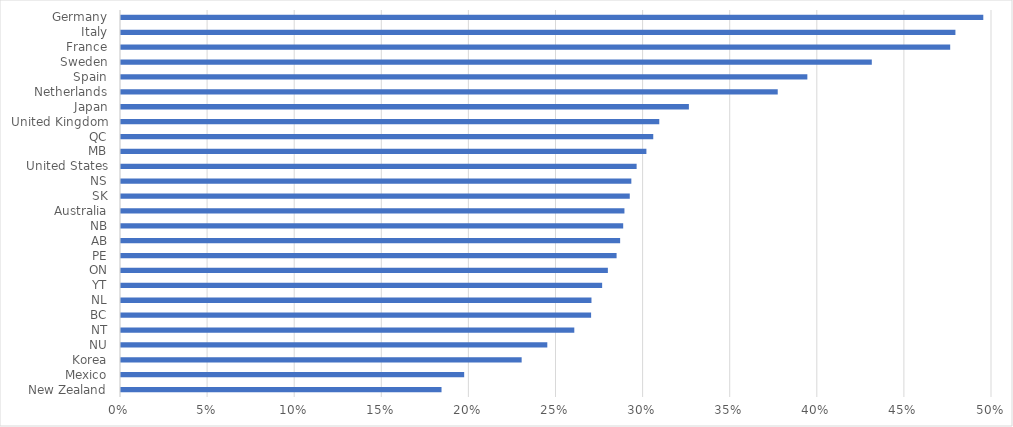
| Category | Single 100 |
|---|---|
| New Zealand | 0.184 |
| Mexico | 0.197 |
| Korea | 0.23 |
| NU | 0.245 |
| NT | 0.26 |
| BC | 0.27 |
| NL | 0.27 |
| YT | 0.276 |
| ON | 0.279 |
| PE | 0.284 |
| AB | 0.287 |
| NB | 0.288 |
| Australia | 0.289 |
| SK | 0.292 |
| NS | 0.293 |
| United States | 0.296 |
| MB | 0.302 |
| QC | 0.306 |
| United Kingdom | 0.309 |
| Japan | 0.326 |
| Netherlands | 0.377 |
| Spain | 0.394 |
| Sweden | 0.431 |
| France | 0.476 |
| Italy | 0.479 |
| Germany | 0.495 |